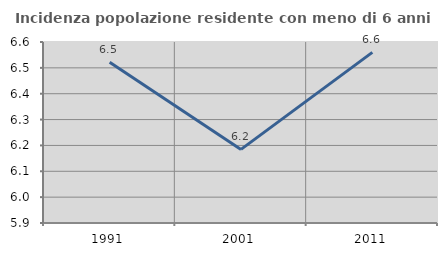
| Category | Incidenza popolazione residente con meno di 6 anni |
|---|---|
| 1991.0 | 6.522 |
| 2001.0 | 6.185 |
| 2011.0 | 6.56 |